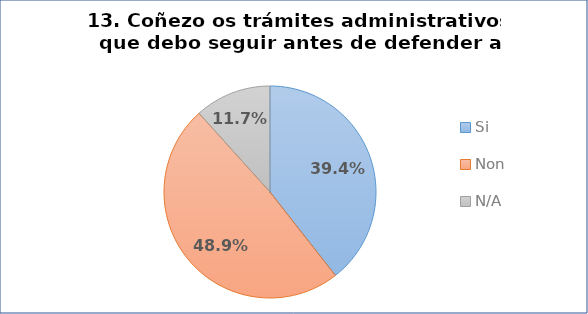
| Category | Pregunta 13. Coñezo os trámites administrativos que debo seguir antes de defender a miña tese |
|---|---|
| Si | 0.394 |
| Non | 0.489 |
| N/A | 0.117 |